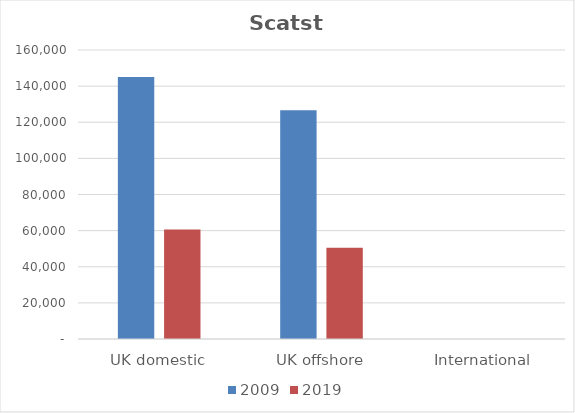
| Category | 2009 | 2019 |
|---|---|---|
| UK domestic | 145104 | 60557 |
| UK offshore | 126705 | 50454 |
| International | 0 | 0 |